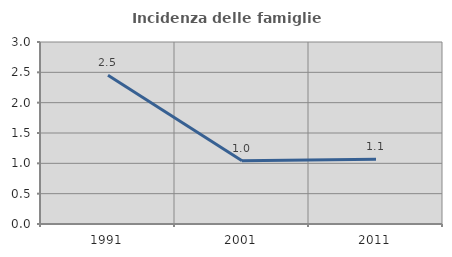
| Category | Incidenza delle famiglie numerose |
|---|---|
| 1991.0 | 2.451 |
| 2001.0 | 1.044 |
| 2011.0 | 1.067 |